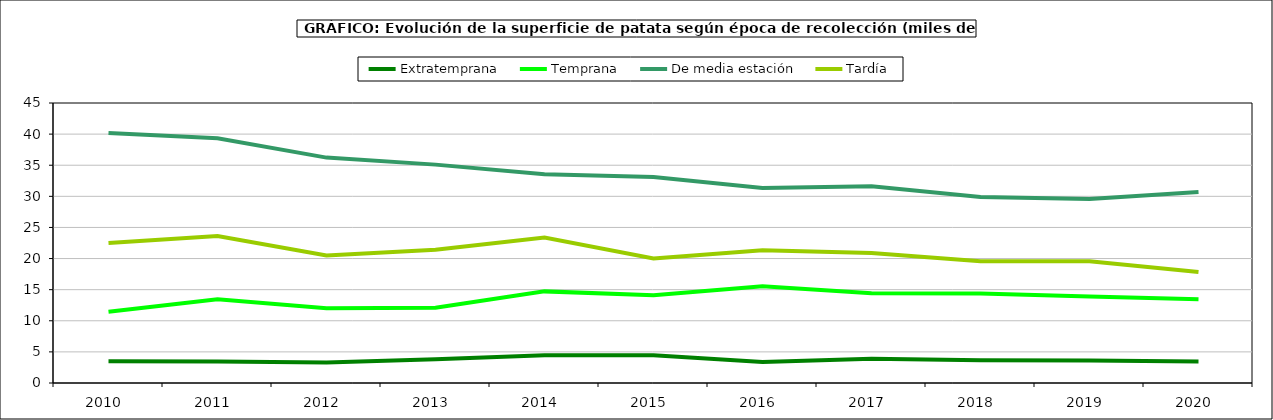
| Category | Extratemprana | Temprana | De media estación | Tardía |
|---|---|---|---|---|
| 2010.0 | 3.488 | 11.444 | 40.198 | 22.492 |
| 2011.0 | 3.471 | 13.439 | 39.332 | 23.623 |
| 2012.0 | 3.309 | 12.004 | 36.224 | 20.486 |
| 2013.0 | 3.821 | 12.091 | 35.096 | 21.424 |
| 2014.0 | 4.468 | 14.725 | 33.547 | 23.388 |
| 2015.0 | 4.465 | 14.085 | 33.109 | 20.017 |
| 2016.0 | 3.373 | 15.55 | 31.323 | 21.344 |
| 2017.0 | 3.917 | 14.433 | 31.633 | 20.895 |
| 2018.0 | 3.647 | 14.386 | 29.899 | 19.556 |
| 2019.0 | 3.597 | 13.907 | 29.563 | 19.583 |
| 2020.0 | 3.44 | 13.449 | 30.682 | 17.833 |